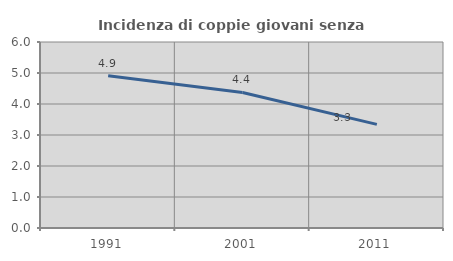
| Category | Incidenza di coppie giovani senza figli |
|---|---|
| 1991.0 | 4.909 |
| 2001.0 | 4.373 |
| 2011.0 | 3.342 |